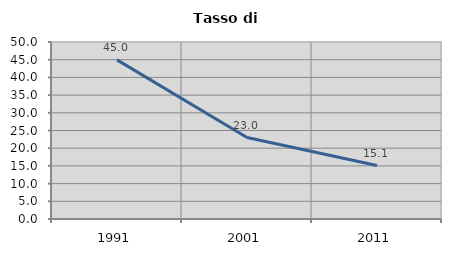
| Category | Tasso di disoccupazione   |
|---|---|
| 1991.0 | 44.952 |
| 2001.0 | 23.011 |
| 2011.0 | 15.09 |